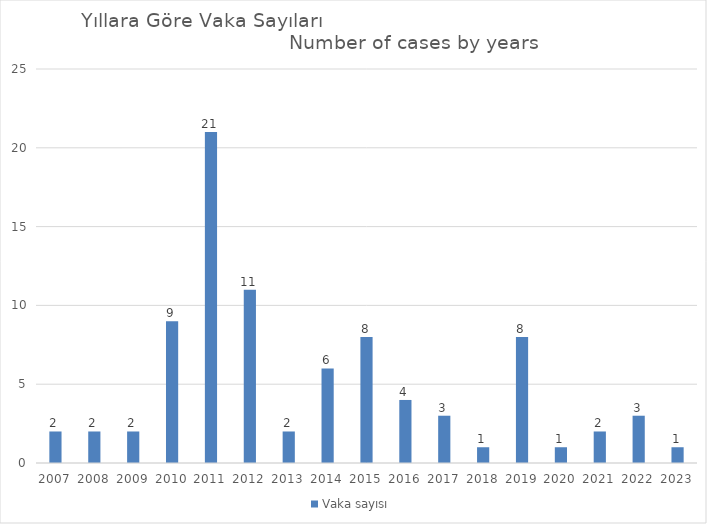
| Category | Vaka sayısı |
|---|---|
| 2007.0 | 2 |
| 2008.0 | 2 |
| 2009.0 | 2 |
| 2010.0 | 9 |
| 2011.0 | 21 |
| 2012.0 | 11 |
| 2013.0 | 2 |
| 2014.0 | 6 |
| 2015.0 | 8 |
| 2016.0 | 4 |
| 2017.0 | 3 |
| 2018.0 | 1 |
| 2019.0 | 8 |
| 2020.0 | 1 |
| 2021.0 | 2 |
| 2022.0 | 3 |
| 2023.0 | 1 |